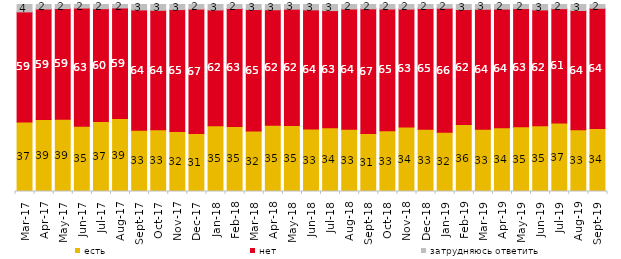
| Category | есть | нет | затрудняюсь ответить |
|---|---|---|---|
| 2017-03-01 | 37.2 | 58.85 | 3.95 |
| 2017-04-01 | 38.5 | 59.1 | 2.4 |
| 2017-05-01 | 38.7 | 59.15 | 2.15 |
| 2017-06-01 | 34.95 | 63.15 | 1.9 |
| 2017-07-01 | 37.4 | 60.35 | 2.25 |
| 2017-08-01 | 39 | 59.15 | 1.85 |
| 2017-09-01 | 32.8 | 64.3 | 2.9 |
| 2017-10-01 | 33 | 63.9 | 3.1 |
| 2017-11-01 | 32.1 | 65.15 | 2.7 |
| 2017-12-01 | 30.95 | 66.6 | 2.45 |
| 2018-01-01 | 35.2 | 61.9 | 2.9 |
| 2018-02-01 | 34.8 | 63.05 | 2.15 |
| 2018-03-01 | 32.35 | 64.95 | 2.7 |
| 2018-04-01 | 35.45 | 61.75 | 2.8 |
| 2018-05-01 | 35.3 | 62.15 | 2.5 |
| 2018-06-01 | 33.45 | 63.7 | 2.85 |
| 2018-07-01 | 34.05 | 62.7 | 3.25 |
| 2018-08-01 | 33.3 | 64.3 | 2.4 |
| 2018-09-01 | 31 | 66.7 | 2.3 |
| 2018-10-01 | 32.55 | 65.05 | 2.4 |
| 2018-11-01 | 34.431 | 63.124 | 2.445 |
| 2018-12-01 | 33.25 | 64.6 | 2.15 |
| 2019-01-01 | 31.75 | 66.25 | 2 |
| 2019-02-01 | 35.8 | 61.5 | 2.7 |
| 2019-03-01 | 33.317 | 64.147 | 2.536 |
| 2019-04-01 | 34.059 | 63.515 | 2.426 |
| 2019-05-01 | 34.621 | 63.2 | 2.179 |
| 2019-06-01 | 35.162 | 61.945 | 2.893 |
| 2019-07-01 | 36.634 | 61.139 | 2.228 |
| 2019-08-01 | 33.067 | 63.736 | 3.197 |
| 2019-09-01 | 33.713 | 64.257 | 2.03 |